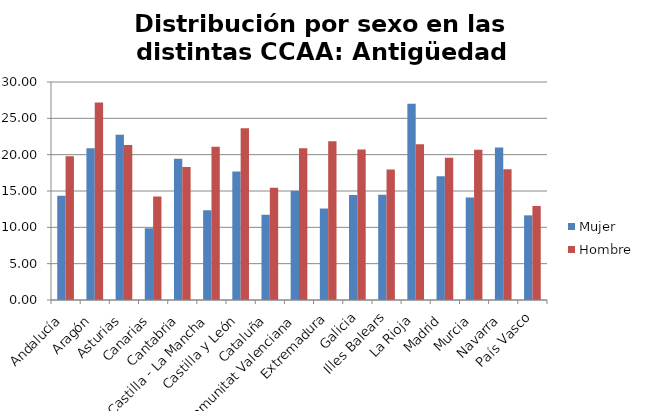
| Category | Mujer | Hombre |
|---|---|---|
| Andalucía | 14.36 | 19.78 |
| Aragón | 20.87 | 27.17 |
| Asturias | 22.73 | 21.32 |
| Canarias | 9.87 | 14.23 |
| Cantabria | 19.44 | 18.3 |
| Castilla - La Mancha | 12.36 | 21.1 |
| Castilla y León | 17.67 | 23.65 |
| Cataluña | 11.74 | 15.45 |
| Comunitat Valenciana | 15.04 | 20.88 |
| Extremadura | 12.59 | 21.83 |
| Galicia | 14.45 | 20.7 |
| Illes Balears | 14.5 | 17.95 |
| La Rioja | 27 | 21.43 |
| Madrid | 17.04 | 19.58 |
| Murcia | 14.11 | 20.68 |
| Navarra | 21 | 18 |
| País Vasco | 11.65 | 12.92 |